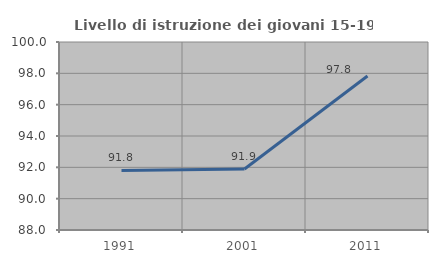
| Category | Livello di istruzione dei giovani 15-19 anni |
|---|---|
| 1991.0 | 91.803 |
| 2001.0 | 91.892 |
| 2011.0 | 97.826 |